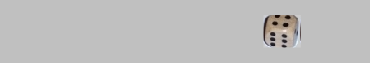
| Category | 1 | 2 | 3 | 4 | 5 | 6 |
|---|---|---|---|---|---|---|
|  | 0 | 0 | 0 | 0 | 0 | 0 |
|  | 0 | 0 | 0 | 0 | 0 | 0 |
|  | 0 | 0 | 0 | 0 | 0 | 0 |
|  | 0 | 0 | 0 | 0 | 0 | 0 |
|  | 0 | 0 | 0 | 0 | 0 | 0 |
| 4 | 0 | 0 | 0 | 1 | 0 | 0 |